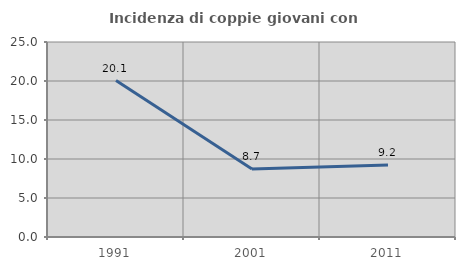
| Category | Incidenza di coppie giovani con figli |
|---|---|
| 1991.0 | 20.053 |
| 2001.0 | 8.706 |
| 2011.0 | 9.217 |